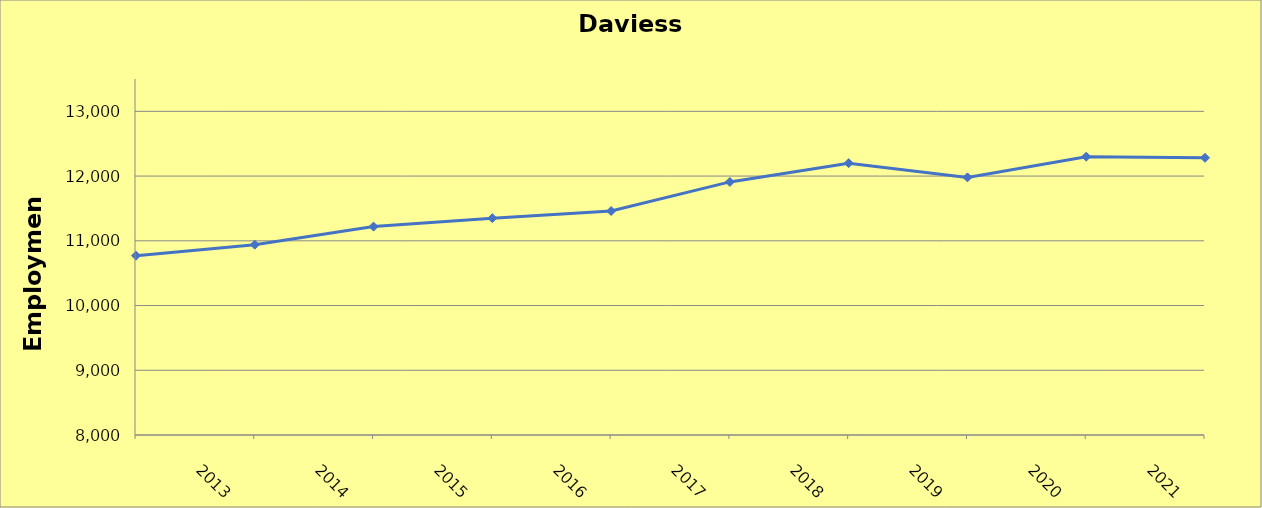
| Category | Daviess County |
|---|---|
| 2013.0 | 10770 |
| 2014.0 | 10940 |
| 2015.0 | 11220 |
| 2016.0 | 11350 |
| 2017.0 | 11460 |
| 2018.0 | 11910 |
| 2019.0 | 12200 |
| 2020.0 | 11980 |
| 2021.0 | 12300 |
| 2022.0 | 12283 |